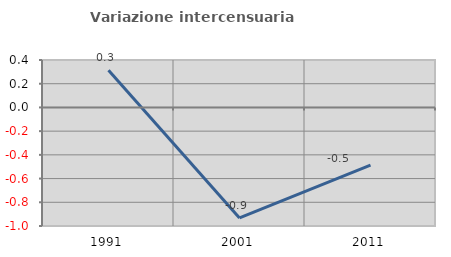
| Category | Variazione intercensuaria annua |
|---|---|
| 1991.0 | 0.313 |
| 2001.0 | -0.932 |
| 2011.0 | -0.487 |